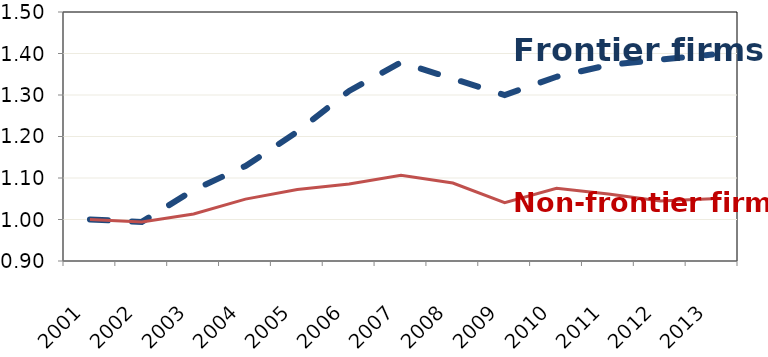
| Category | Average | Non-frontier |
|---|---|---|
| 2001.0 | 1 | 1 |
| 2002.0 | 0.994 | 0.994 |
| 2003.0 | 1.071 | 1.013 |
| 2004.0 | 1.129 | 1.049 |
| 2005.0 | 1.211 | 1.072 |
| 2006.0 | 1.31 | 1.085 |
| 2007.0 | 1.379 | 1.107 |
| 2008.0 | 1.339 | 1.088 |
| 2009.0 | 1.3 | 1.04 |
| 2010.0 | 1.344 | 1.075 |
| 2011.0 | 1.372 | 1.062 |
| 2012.0 | 1.385 | 1.045 |
| 2013.0 | 1.397 | 1.05 |